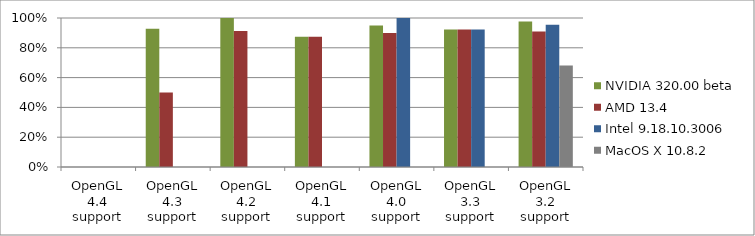
| Category | NVIDIA 320.00 beta | AMD 13.4 | Intel 9.18.10.3006 | MacOS X 10.8.2 |
|---|---|---|---|---|
| OpenGL 4.4 support | 0 | 0 | 0 | 0 |
| OpenGL 4.3 support | 0.929 | 0.5 | 0 | 0 |
| OpenGL 4.2 support | 1 | 0.913 | 0 | 0 |
| OpenGL 4.1 support | 0.875 | 0.875 | 0 | 0 |
| OpenGL 4.0 support | 0.95 | 0.9 | 1 | 0 |
| OpenGL 3.3 support | 0.923 | 0.923 | 0.923 | 0 |
| OpenGL 3.2 support | 0.977 | 0.909 | 0.955 | 0.682 |